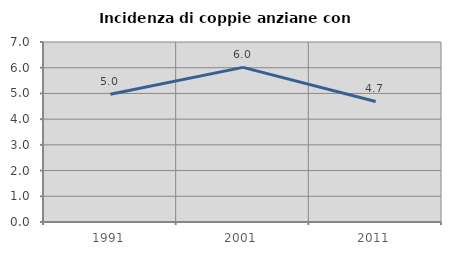
| Category | Incidenza di coppie anziane con figli |
|---|---|
| 1991.0 | 4.967 |
| 2001.0 | 6.013 |
| 2011.0 | 4.688 |